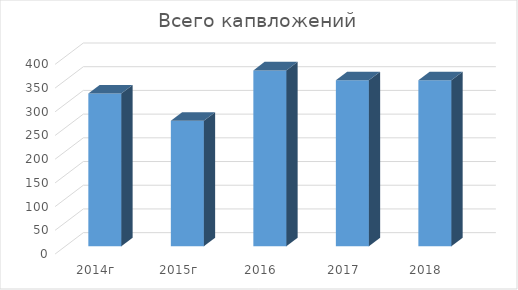
| Category | Всего капвложений |
|---|---|
| 2014г | 322 |
| 2015г | 264.7 |
| 2016 | 371 |
| 2017 | 350 |
| 2018 | 350 |